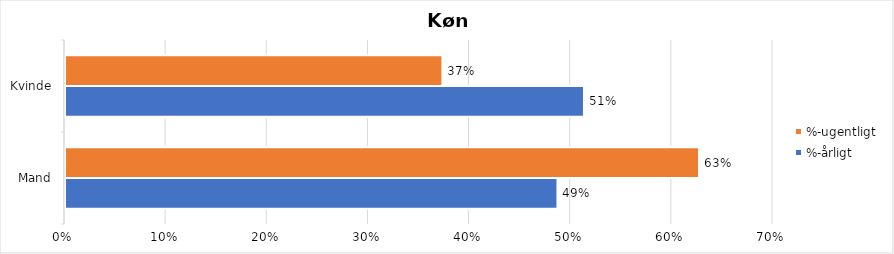
| Category | %-årligt | %-ugentligt |
|---|---|---|
| Mand | 0.487 | 0.627 |
| Kvinde | 0.513 | 0.373 |